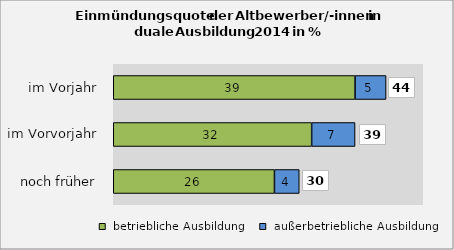
| Category |  betriebliche Ausbildung |  außerbetriebliche Ausbildung |
|---|---|---|
|  noch früher | 26 | 4 |
|  im Vorvorjahr | 32 | 7 |
|  im Vorjahr | 39 | 5 |